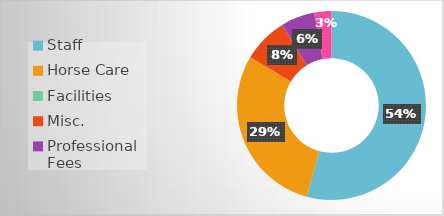
| Category | Series 0 |
|---|---|
| Staff | 29400 |
| Horse Care | 15900 |
| Facilities | 0 |
| Misc. | 4200 |
| Professional Fees | 3140 |
| Insurance | 1600 |